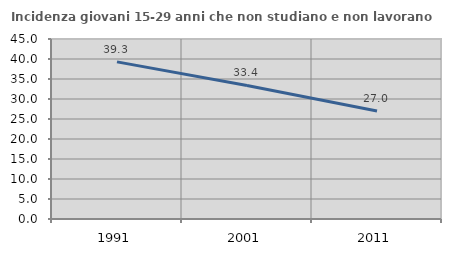
| Category | Incidenza giovani 15-29 anni che non studiano e non lavorano  |
|---|---|
| 1991.0 | 39.276 |
| 2001.0 | 33.395 |
| 2011.0 | 27.01 |